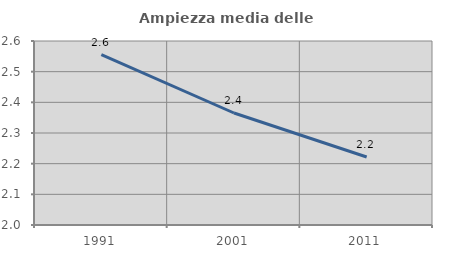
| Category | Ampiezza media delle famiglie |
|---|---|
| 1991.0 | 2.555 |
| 2001.0 | 2.365 |
| 2011.0 | 2.222 |